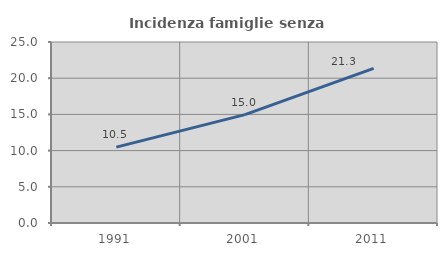
| Category | Incidenza famiglie senza nuclei |
|---|---|
| 1991.0 | 10.477 |
| 2001.0 | 14.972 |
| 2011.0 | 21.347 |